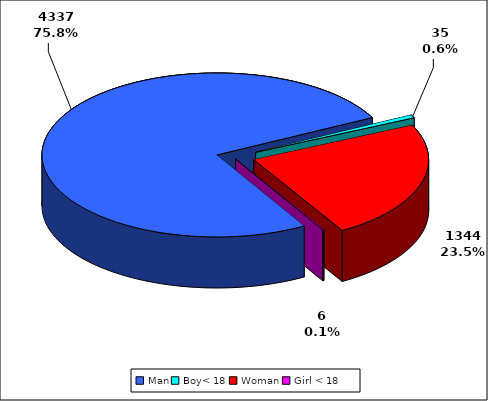
| Category | TOTAL |
|---|---|
| Man | 4337 |
| Boy< 18 | 35 |
| Woman | 1344 |
| Girl < 18 | 6 |